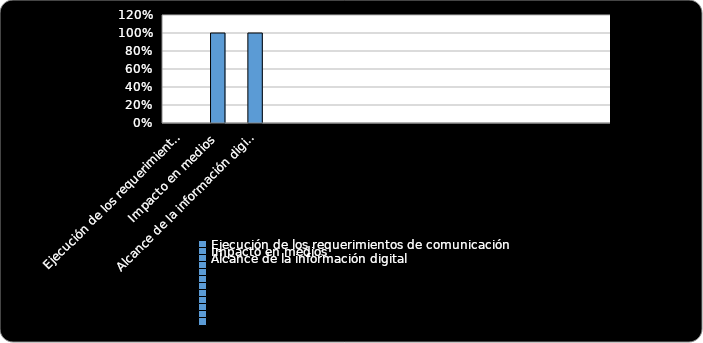
| Category | % Cumplimiento  |
|---|---|
| Ejecución de los requerimientos de comunicación | 0 |
| Impacto en medios | 1 |
| Alcance de la información digital | 1 |